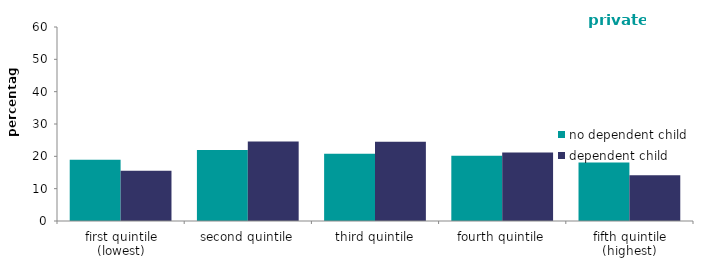
| Category | no dependent child | dependent child |
|---|---|---|
| first quintile (lowest) | 18.947 | 15.564 |
| second quintile | 21.964 | 24.615 |
| third quintile | 20.827 | 24.486 |
| fourth quintile | 20.205 | 21.152 |
| fifth quintile (highest) | 18.058 | 14.183 |